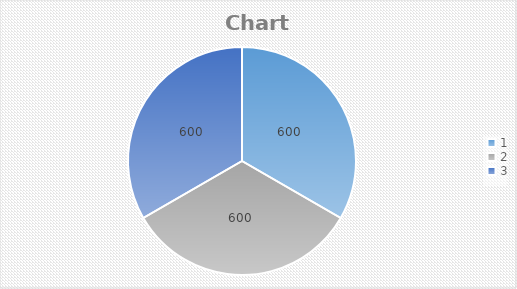
| Category | Series 0 |
|---|---|
| 0 | 600 |
| 1 | 600 |
| 2 | 600 |